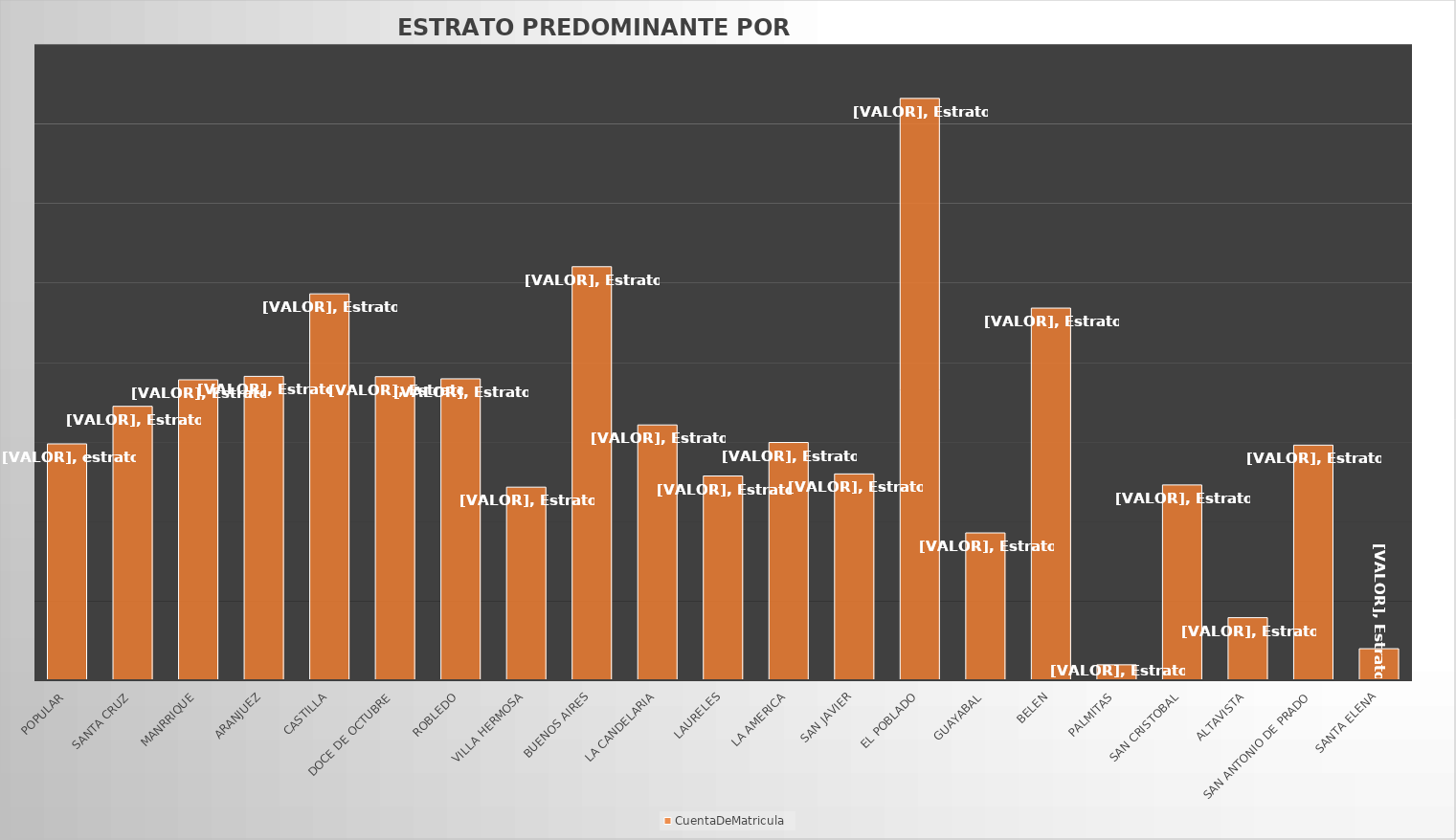
| Category | CuentaDeMatricula |
|---|---|
| POPULAR | 14859 |
| SANTA CRUZ | 17221 |
| MANRRIQUE | 18889 |
| ARANJUEZ | 19104 |
| CASTILLA | 24293 |
| DOCE DE OCTUBRE | 19084 |
| ROBLEDO | 18951 |
| VILLA HERMOSA | 12140 |
| BUENOS AIRES | 25999 |
| LA CANDELARIA | 16049 |
| LAURELES | 12842 |
| LA AMERICA | 14946 |
| SAN JAVIER | 12971 |
| EL POBLADO | 36580 |
| GUAYABAL | 9262 |
| BELEN | 23396 |
| PALMITAS | 970 |
| SAN CRISTOBAL | 12278 |
| ALTAVISTA | 3933 |
| SAN ANTONIO DE PRADO | 14780 |
| SANTA ELENA | 1983 |